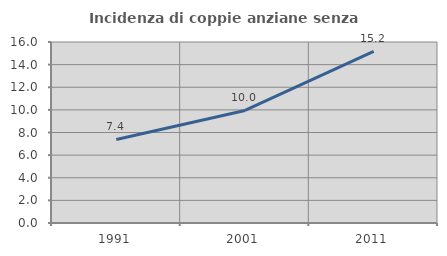
| Category | Incidenza di coppie anziane senza figli  |
|---|---|
| 1991.0 | 7.383 |
| 2001.0 | 9.951 |
| 2011.0 | 15.167 |